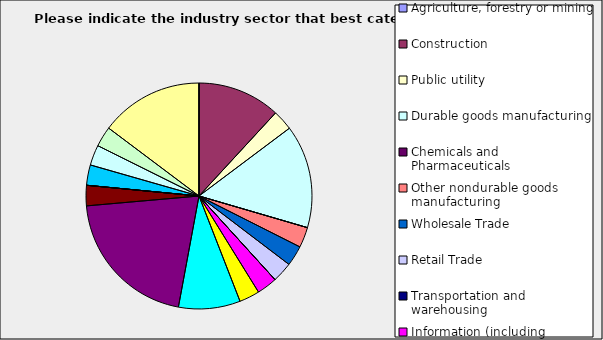
| Category | Series 0 |
|---|---|
| Agriculture, forestry or mining | 0 |
| Construction | 0.118 |
| Public utility | 0.029 |
| Durable goods manufacturing | 0.147 |
| Chemicals and Pharmaceuticals | 0 |
| Other nondurable goods manufacturing | 0.029 |
| Wholesale Trade | 0.029 |
| Retail Trade | 0.029 |
| Transportation and warehousing | 0 |
| Information (including broadcasting and telecommunication) | 0.029 |
| Finance and Insurance | 0.029 |
| Real Estate | 0.088 |
| Professional, scientific and technical services | 0.206 |
| Consulting | 0.029 |
| Administrative and office services (including waste management) | 0 |
| Education | 0 |
| Health Care and social services | 0.029 |
| Arts, entertainment and recreation | 0.029 |
| Accommodation and food services | 0.029 |
| Other | 0.147 |